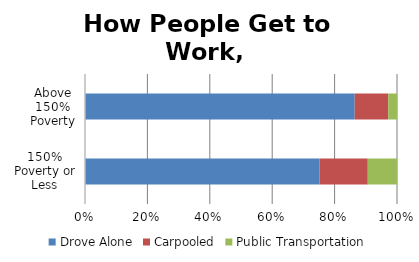
| Category | Drove Alone | Carpooled | Public Transportation |
|---|---|---|---|
| 150% Poverty or Less | 0.647 | 0.133 | 0.081 |
| Above 150% Poverty | 0.745 | 0.093 | 0.024 |